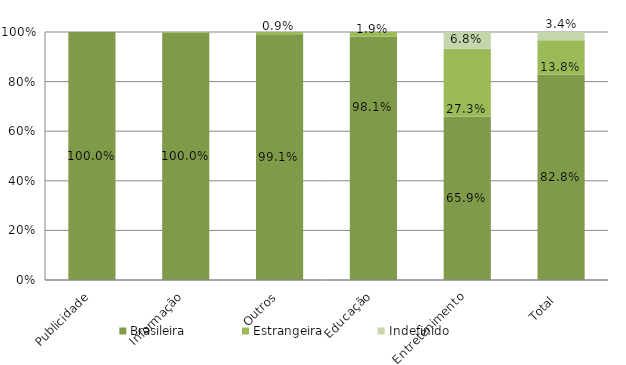
| Category | Brasileira | Estrangeira | Indefinido |
|---|---|---|---|
| Publicidade | 1 | 0 | 0 |
| Informação | 1 | 0.003 | 0 |
| Outros | 0.991 | 0.009 | 0 |
| Educação | 0.981 | 0.019 | 0 |
| Entretenimento | 0.659 | 0.273 | 0.068 |
| Total  | 0.828 | 0.138 | 0.034 |